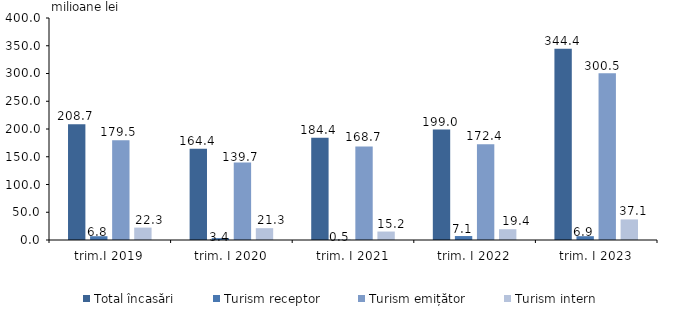
| Category | Total încasări | Turism receptor | Turism emițător | Turism intern |
|---|---|---|---|---|
| trim.I 2019 | 208.66 | 6.82 | 179.51 | 22.325 |
| trim. I 2020 | 164.4 | 3.43 | 139.7 | 21.27 |
| trim. I 2021 | 184.38 | 0.486 | 168.659 | 15.238 |
| trim. I 2022 | 198.98 | 7.13 | 172.43 | 19.41 |
| trim. I 2023 | 344.42 | 6.86 | 300.49 | 37.07 |